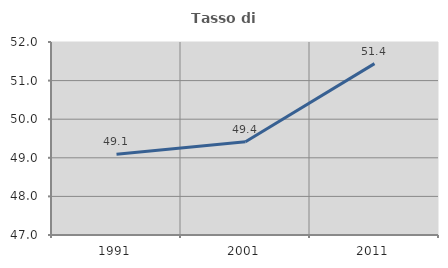
| Category | Tasso di occupazione   |
|---|---|
| 1991.0 | 49.094 |
| 2001.0 | 49.415 |
| 2011.0 | 51.44 |